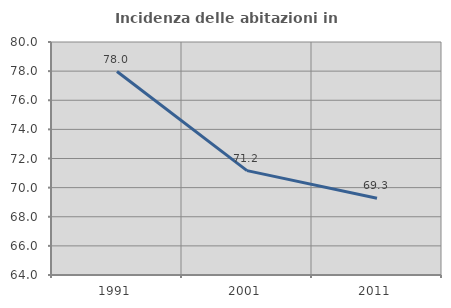
| Category | Incidenza delle abitazioni in proprietà  |
|---|---|
| 1991.0 | 77.974 |
| 2001.0 | 71.165 |
| 2011.0 | 69.27 |